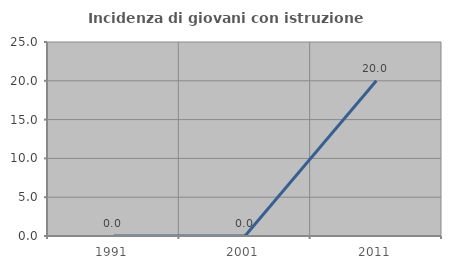
| Category | Incidenza di giovani con istruzione universitaria |
|---|---|
| 1991.0 | 0 |
| 2001.0 | 0 |
| 2011.0 | 20 |